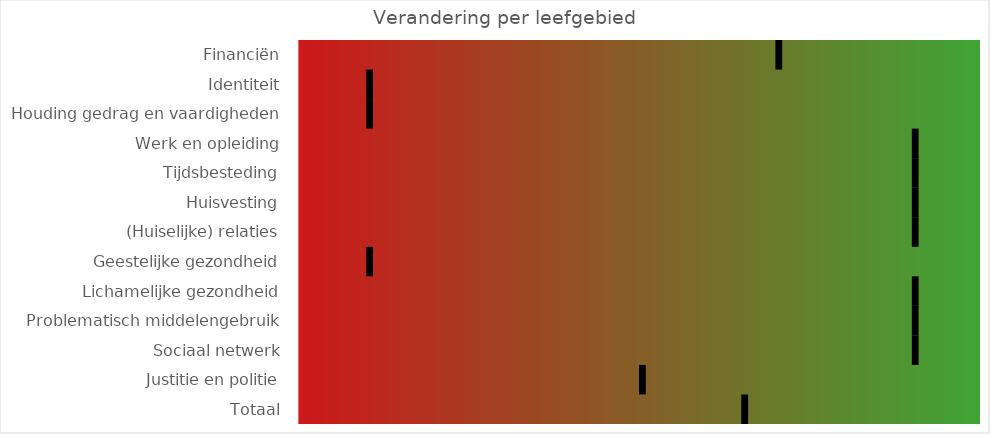
| Category | Telling | Start | Toename | Afname | 0,05 |
|---|---|---|---|---|---|
| Financiën |  | 4 | 0 | 0 | 0.05 |
| Identiteit |  | 1 | 0 | 0 | 0.05 |
| Houding gedrag en vaardigheden |  | 1 | 0 | 0 | 0.05 |
| Werk en opleiding |  | 5 | 0 | 0 | 0.05 |
| Tijdsbesteding |  | 5 | 0 | 0 | 0.05 |
| Huisvesting |  | 5 | 0 | 0 | 0.05 |
| (Huiselijke) relaties |  | 5 | 0 | 0 | 0.05 |
| Geestelijke gezondheid |  | 1 | 0 | 0 | 0.05 |
| Lichamelijke gezondheid |  | 5 | 0 | 0 | 0.05 |
| Problematisch middelengebruik |  | 5 | 0 | 0 | 0.05 |
| Sociaal netwerk |  | 5 | 0 | 0 | 0.05 |
| Justitie en politie |  | 3 | 0 | 0 | 0.05 |
| Totaal |  | 3.75 | 0 | 0 | 0.05 |